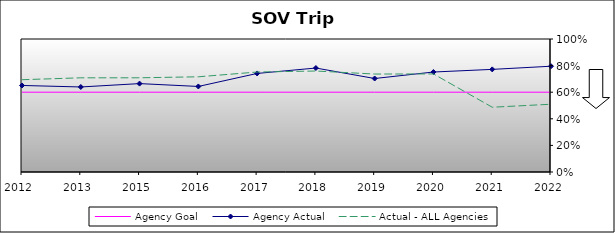
| Category | Agency Goal | Agency Actual | Actual - ALL Agencies |
|---|---|---|---|
| 2012.0 | 0.6 | 0.651 | 0.694 |
| 2013.0 | 0.6 | 0.639 | 0.708 |
| 2015.0 | 0.6 | 0.665 | 0.708 |
| 2016.0 | 0.6 | 0.643 | 0.716 |
| 2017.0 | 0.6 | 0.741 | 0.752 |
| 2018.0 | 0.6 | 0.782 | 0.759 |
| 2019.0 | 0.6 | 0.703 | 0.736 |
| 2020.0 | 0.6 | 0.752 | 0.737 |
| 2021.0 | 0.6 | 0.772 | 0.487 |
| 2022.0 | 0.6 | 0.795 | 0.509 |